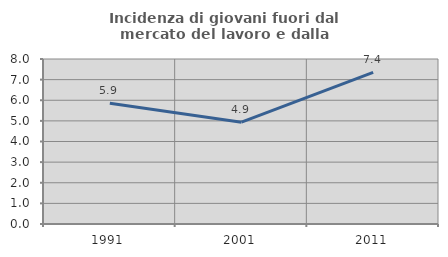
| Category | Incidenza di giovani fuori dal mercato del lavoro e dalla formazione  |
|---|---|
| 1991.0 | 5.854 |
| 2001.0 | 4.936 |
| 2011.0 | 7.353 |